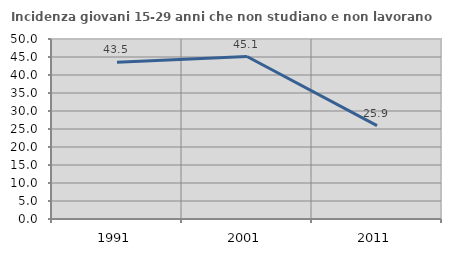
| Category | Incidenza giovani 15-29 anni che non studiano e non lavorano  |
|---|---|
| 1991.0 | 43.51 |
| 2001.0 | 45.136 |
| 2011.0 | 25.926 |